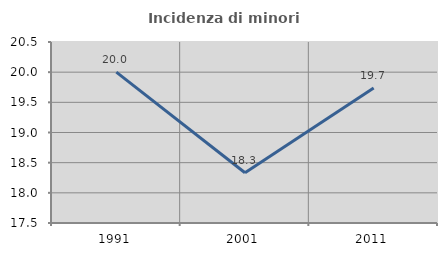
| Category | Incidenza di minori stranieri |
|---|---|
| 1991.0 | 20 |
| 2001.0 | 18.333 |
| 2011.0 | 19.737 |